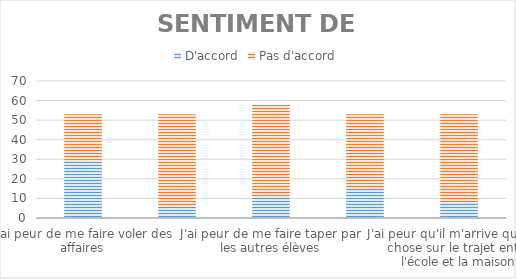
| Category | D'accord | Pas d'accord |
|---|---|---|
| J'ai peur de me faire voler des affaires | 29 | 24 |
| J'ai peur quand je suis à l'école | 7 | 46 |
| J'ai peur de me faire taper par les autres élèves | 11 | 47 |
| J'ai peur que des inconnus entrent dans l'école pour m'embêter | 16 | 37 |
| J'ai peur qu'il m'arrive quelque chose sur le trajet entre l'école et la maison | 9 | 44 |